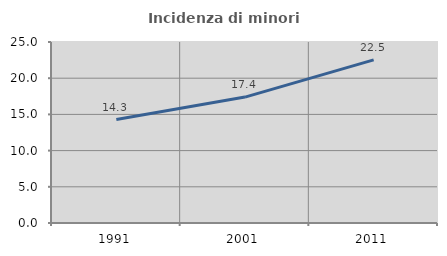
| Category | Incidenza di minori stranieri |
|---|---|
| 1991.0 | 14.286 |
| 2001.0 | 17.391 |
| 2011.0 | 22.535 |